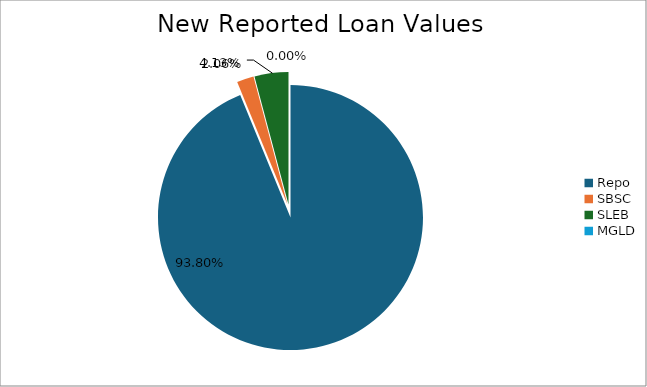
| Category | Series 0 |
|---|---|
| Repo | 9987115.956 |
| SBSC | 219728.923 |
| SLEB | 440007.524 |
| MGLD | 87.938 |